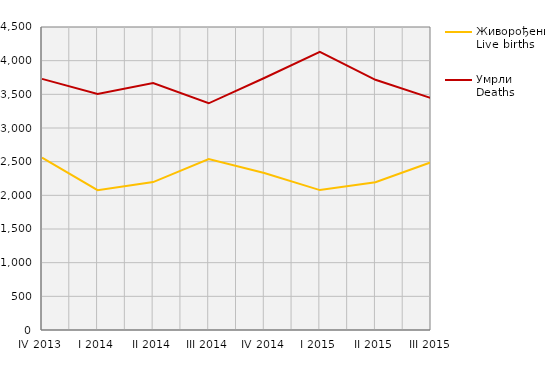
| Category | Живорођени
Live births | Умрли
Deaths |
|---|---|---|
| IV 2013 | 2561 | 3730 |
| I 2014 | 2076 | 3505 |
| II 2014 | 2197 | 3669 |
| III 2014 | 2540 | 3367 |
| IV 2014 | 2332 | 3743 |
| I 2015 | 2078 | 4132 |
| II 2015 | 2194 | 3716 |
| III 2015 | 2492 | 3444 |